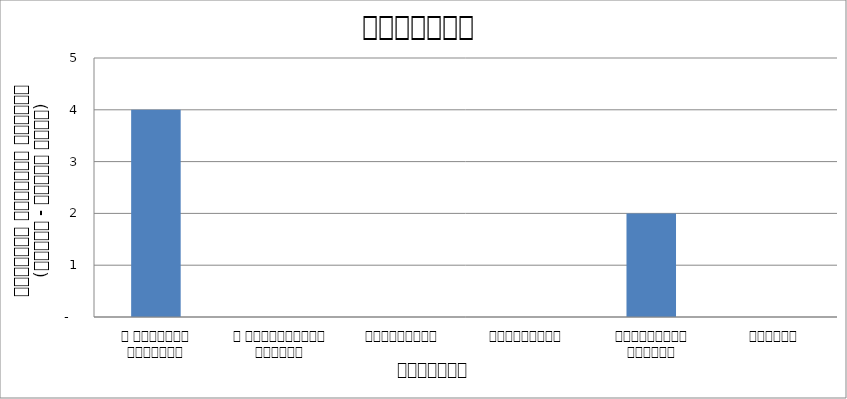
| Category | आन्दोलन |
|---|---|
| द हिमालयन टाइम्स् | 4 |
| द काठमाण्डौं पोस्ट् | 0 |
| रिपब्लिका | 0 |
| कान्तिपुर | 0 |
| अन्नपूर्ण पोस्ट् | 2 |
| नागरिक | 0 |